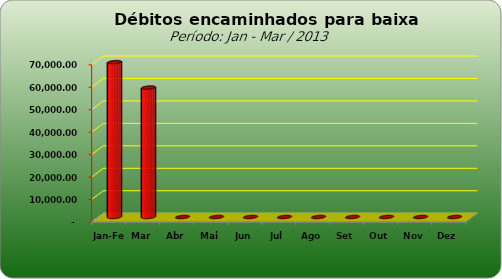
| Category | Series 0 |
|---|---|
| Jan-Fev | 68983.48 |
| Mar | 57649.63 |
| Abr | 0 |
| Mai | 0 |
| Jun | 0 |
| Jul | 0 |
| Ago | 0 |
| Set | 0 |
| Out | 0 |
| Nov | 0 |
| Dez | 0 |